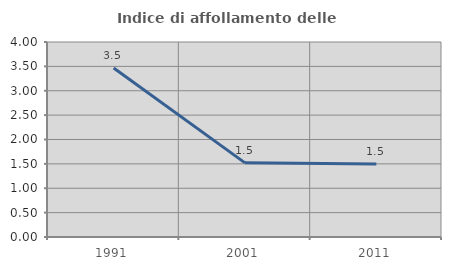
| Category | Indice di affollamento delle abitazioni  |
|---|---|
| 1991.0 | 3.466 |
| 2001.0 | 1.521 |
| 2011.0 | 1.495 |